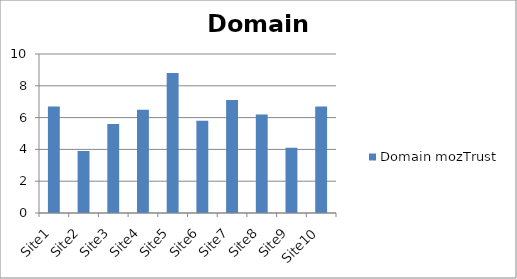
| Category | Domain mozTrust |
|---|---|
| Site1 | 6.7 |
| Site2 | 3.9 |
| Site3 | 5.6 |
| Site4 | 6.5 |
| Site5 | 8.8 |
| Site6 | 5.8 |
| Site7 | 7.1 |
| Site8 | 6.2 |
| Site9 | 4.1 |
| Site10 | 6.7 |